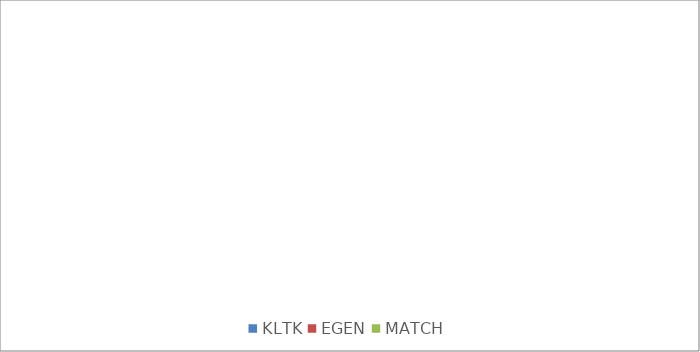
| Category | Series 2 | Series 3 | Series 1 | Series 0 |
|---|---|---|---|---|
| KLTK | 0 | 0 | 0 | 0 |
| EGEN | 0 | 0 | 0 | 0 |
| MATCH | 0 | 0 | 0 | 0 |